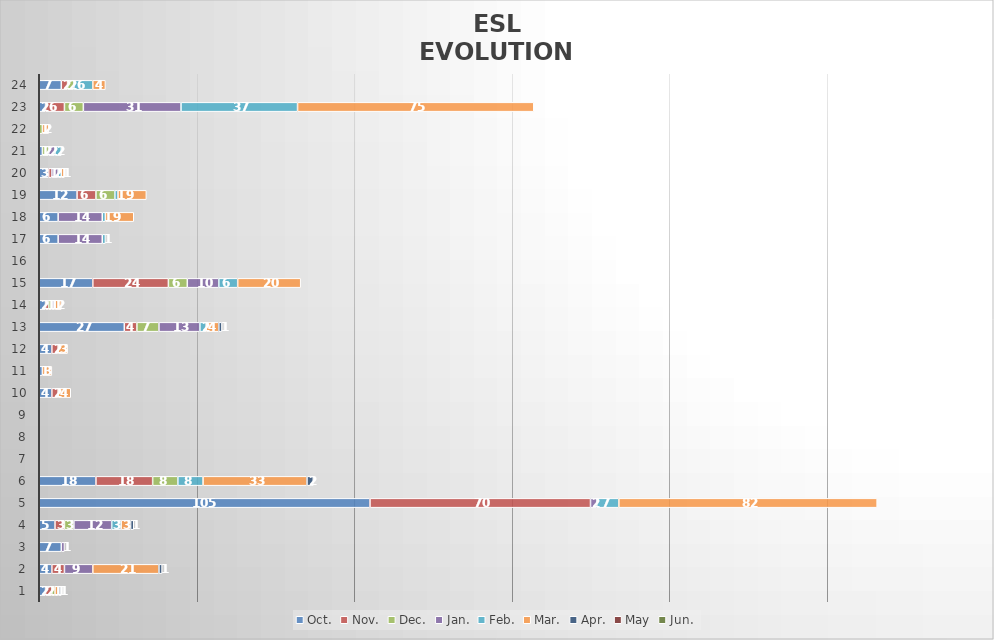
| Category | Oct. | Nov. | Dec. | Jan. | Feb. | Mar. | Apr. | May | Jun. |
|---|---|---|---|---|---|---|---|---|---|
| 1.0 | 2 | 2 | 1 | 0 | 0 | 1 | 1 | 0 | 0 |
| 2.0 | 4 | 4 | 0 | 9 | 0 | 21 | 1 | 0 | 0 |
| 3.0 | 7 | 0 | 0 | 1 | 0 | 0 | 0 | 0 | 0 |
| 4.0 | 5 | 3 | 3 | 12 | 3 | 3 | 1 | 0 | 0 |
| 5.0 | 105 | 70 | 0 | 2 | 7 | 82 | 0 | 0 | 0 |
| 6.0 | 18 | 18 | 8 | 0 | 8 | 33 | 2 | 0 | 0 |
| 7.0 | 0 | 0 | 0 | 0 | 0 | 0 | 0 | 0 | 0 |
| 8.0 | 0 | 0 | 0 | 0 | 0 | 0 | 0 | 0 | 0 |
| 9.0 | 0 | 0 | 0 | 0 | 0 | 0 | 0 | 0 | 0 |
| 10.0 | 4 | 2 | 0 | 0 | 0 | 4 | 0 | 0 | 0 |
| 11.0 | 1 | 0 | 0 | 0 | 0 | 3 | 0 | 0 | 0 |
| 12.0 | 4 | 2 | 0 | 0 | 0 | 3 | 0 | 0 | 0 |
| 13.0 | 27 | 4 | 7 | 13 | 2 | 4 | 1 | 0 | 0 |
| 14.0 | 2 | 1 | 1 | 1 | 0 | 2 | 0 | 0 | 0 |
| 15.0 | 17 | 24 | 6 | 10 | 6 | 20 | 0 | 0 | 0 |
| 16.0 | 0 | 0 | 0 | 0 | 0 | 0 | 0 | 0 | 0 |
| 17.0 | 6 | 0 | 0 | 14 | 1 | 0 | 0 | 0 | 0 |
| 18.0 | 6 | 0 | 0 | 14 | 1 | 9 | 0 | 0 | 0 |
| 19.0 | 12 | 6 | 6 | 0 | 1 | 9 | 0 | 0 | 0 |
| 20.0 | 3 | 1 | 0 | 2 | 1 | 1 | 0 | 0 | 0 |
| 21.0 | 1 | 0 | 2 | 2 | 2 | 0 | 0 | 0 | 0 |
| 22.0 | 0 | 0 | 1 | 0 | 0 | 2 | 0 | 0 | 0 |
| 23.0 | 2 | 6 | 6 | 31 | 37 | 75 | 0 | 0 | 0 |
| 24.0 | 7 | 2 | 2 | 0 | 6 | 4 | 0 | 0 | 0 |